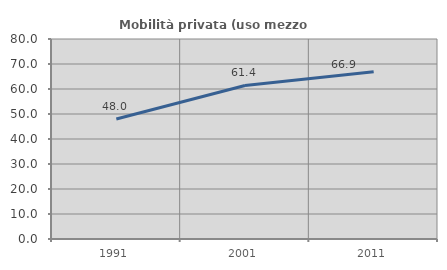
| Category | Mobilità privata (uso mezzo privato) |
|---|---|
| 1991.0 | 47.988 |
| 2001.0 | 61.413 |
| 2011.0 | 66.921 |